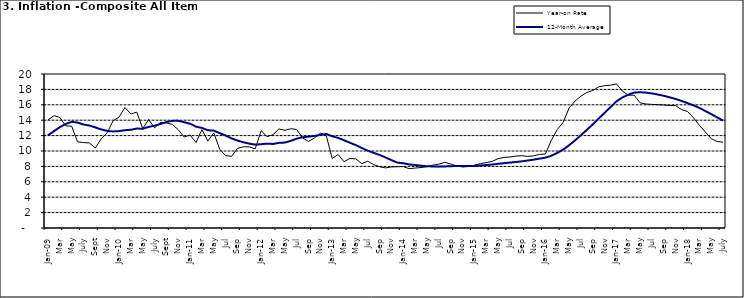
| Category | Year-on Rate | 12-Month Average |
|---|---|---|
| Jan-09 | 14.034 | 12.032 |
| Feb | 14.584 | 12.567 |
| Mar | 14.366 | 13.101 |
| Apr | 13.268 | 13.51 |
| May | 13.212 | 13.787 |
| June | 11.194 | 13.694 |
| July | 11.09 | 13.437 |
| Aug | 11.046 | 13.307 |
| Sept | 10.39 | 13.065 |
| Oct | 11.588 | 12.803 |
| Nov | 12.368 | 12.609 |
| Dec | 13.93 | 12.538 |
| Jan-10 | 14.398 | 12.586 |
| Feb | 15.649 | 12.7 |
| Mar | 14.812 | 12.757 |
| Apr | 15.044 | 12.915 |
| May | 12.915 | 12.893 |
| June | 14.099 | 13.132 |
| July | 13.002 | 13.284 |
| Aug | 13.702 | 13.5 |
| Sept | 13.65 | 13.764 |
| Oct | 13.45 | 13.908 |
| Nov | 12.766 | 13.928 |
| Dec | 11.815 | 13.74 |
| Jan-11 | 12.08 | 13.542 |
| Feb | 11.1 | 13.161 |
| Mar | 12.779 | 13.001 |
| Apr | 11.291 | 12.694 |
| May | 12.352 | 12.648 |
| Jun | 10.23 | 12.321 |
| Jul | 9.397 | 12.009 |
| Aug | 9.301 | 11.635 |
| Sep | 10.339 | 11.363 |
| Oct | 10.544 | 11.13 |
| Nov | 10.54 | 10.952 |
| Dec | 10.283 | 10.826 |
| Jan-12 | 12.626 | 10.886 |
| Feb | 11.866 | 10.955 |
| Mar | 12.111 | 10.914 |
| Apr | 12.866 | 11.054 |
| May | 12.688 | 11.096 |
| Jun | 12.892 | 11.32 |
| Jul | 12.797 | 11.599 |
| Aug | 11.689 | 11.791 |
| Sep | 11.253 | 11.859 |
| Oct | 11.693 | 11.948 |
| Nov | 12.32 | 12.091 |
| Dec | 11.981 | 12.224 |
| Jan-13 | 9.031 | 11.908 |
| Feb | 9.542 | 11.703 |
| Mar | 8.593 | 11.394 |
| Apr | 9.052 | 11.072 |
| May | 8.964 | 10.761 |
| Jun | 8.353 | 10.383 |
| Jul | 8.682 | 10.047 |
| Aug | 8.231 | 9.761 |
| Sep | 7.952 | 9.486 |
| Oct | 7.807 | 9.167 |
| Nov | 7.931 | 8.815 |
| Dec | 7.957 | 8.496 |
| Jan-14 | 7.977 | 8.408 |
| Feb | 7.707 | 8.257 |
| Mar | 7.783 | 8.19 |
| Apr | 7.851 | 8.092 |
| May | 7.965 | 8.012 |
| Jun | 8.167 | 7.998 |
| Jul | 8.281 | 7.968 |
| Aug | 8.534 | 7.996 |
| Sep | 8.317 | 8.027 |
| Oct | 8.06 | 8.047 |
| Nov | 7.927 | 8.046 |
| Dec | 7.978 | 8.047 |
| Jan-15 | 8.157 | 8.063 |
| Feb | 8.359 | 8.117 |
| Mar | 8.494 | 8.176 |
| Apr | 8.655 | 8.243 |
| May | 9.003 | 8.331 |
| Jun | 9.168 | 8.417 |
| Jul | 9.218 | 8.497 |
| Aug | 9.336 | 8.566 |
| Sep | 9.394 | 8.658 |
| Oct | 9.296 | 8.76 |
| Nov | 9.368 | 8.879 |
| Dec | 9.554 | 9.009 |
| Jan-16 | 9.617 | 9.13 |
| Feb | 11.379 | 9.386 |
| Mar | 12.775 | 9.751 |
| Apr | 13.721 | 10.182 |
| May | 15.577 | 10.746 |
| Jun | 16.48 | 11.372 |
| Jul | 17.127 | 12.045 |
| Aug | 17.609 | 12.744 |
| Sep | 17.852 | 13.454 |
| Oct | 18.33 | 14.206 |
| Nov | 18.476 | 14.958 |
| Dec | 18.547 | 15.697 |
| Jan-17 | 18.719 | 16.441 |
| Feb | 17.78 | 16.958 |
| Mar | 17.256 | 17.315 |
| Apr | 17.244 | 17.591 |
| May | 16.251 | 17.628 |
| Jun | 16.098 | 17.578 |
| Jul | 16.053 | 17.475 |
| Aug | 16.012 | 17.331 |
| Sep | 15.979 | 17.17 |
| Oct | 15.905 | 16.968 |
| Nov | 15.901 | 16.76 |
| Dec | 15.372 | 16.502 |
| Jan-18 | 15.127 | 16.215 |
| Feb | 14.33 | 15.93 |
| Mar | 13.337 | 15.599 |
| Apr | 12.482 | 15.196 |
| May | 11.608 | 14.793 |
| June | 11.231 | 14.371 |
| July | 11.142 | 13.95 |